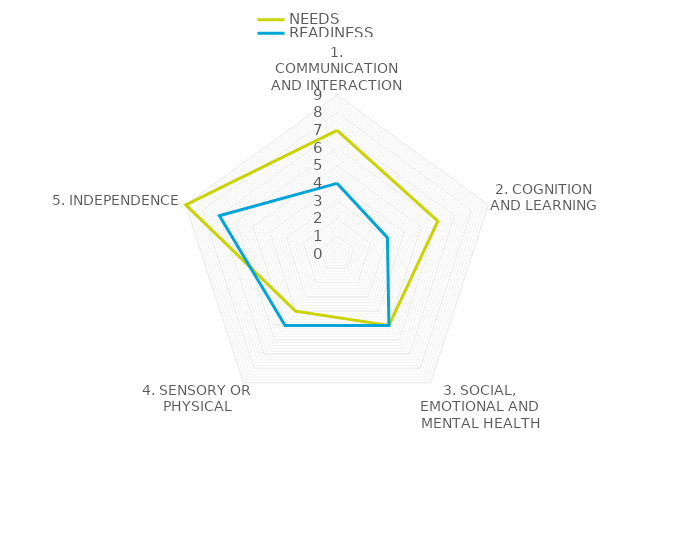
| Category | NEEDS | READINESS |
|---|---|---|
| 1. COMMUNICATION AND INTERACTION | 7 | 4 |
| 2. COGNITION AND LEARNING | 6 | 3 |
| 3. SOCIAL, EMOTIONAL AND MENTAL HEALTH | 5 | 5 |
| 4. SENSORY OR PHYSICAL | 4 | 5 |
| 5. INDEPENDENCE | 9 | 7 |